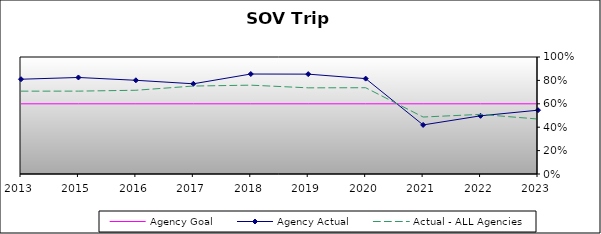
| Category | Agency Goal | Agency Actual | Actual - ALL Agencies |
|---|---|---|---|
| 2013.0 | 0.6 | 0.81 | 0.708 |
| 2015.0 | 0.6 | 0.825 | 0.708 |
| 2016.0 | 0.6 | 0.801 | 0.716 |
| 2017.0 | 0.6 | 0.771 | 0.752 |
| 2018.0 | 0.6 | 0.854 | 0.759 |
| 2019.0 | 0.6 | 0.854 | 0.736 |
| 2020.0 | 0.6 | 0.815 | 0.737 |
| 2021.0 | 0.6 | 0.419 | 0.487 |
| 2022.0 | 0.6 | 0.497 | 0.509 |
| 2023.0 | 0.6 | 0.546 | 0.47 |